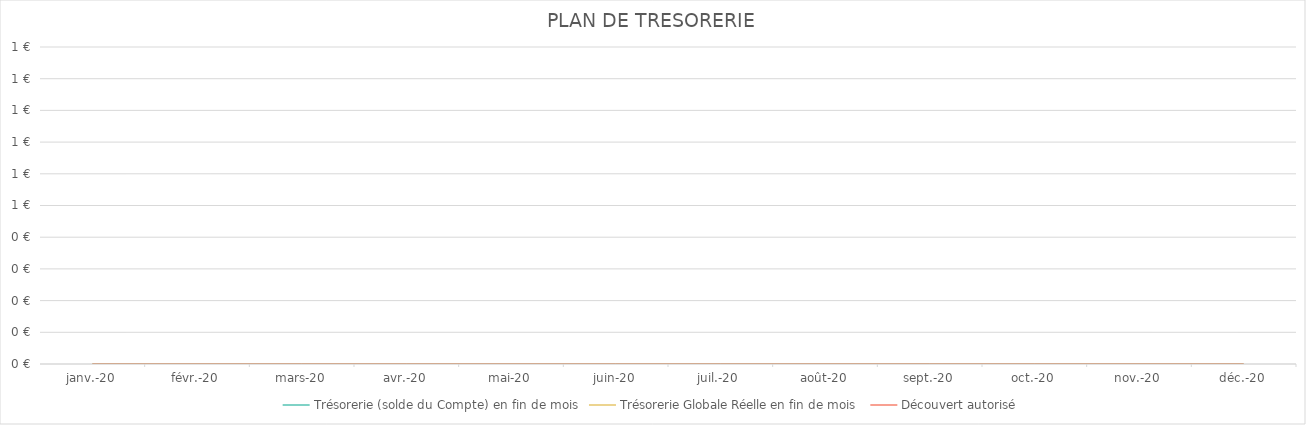
| Category | Trésorerie (solde du Compte) en fin de mois | Trésorerie Globale Réelle en fin de mois | Découvert autorisé |
|---|---|---|---|
| 2020-01-01 | 0 | 0 | 0 |
| 2020-02-29 | 0 | 0 | 0 |
| 2020-03-31 | 0 | 0 | 0 |
| 2020-04-30 | 0 | 0 | 0 |
| 2020-05-31 | 0 | 0 | 0 |
| 2020-06-30 | 0 | 0 | 0 |
| 2020-07-31 | 0 | 0 | 0 |
| 2020-08-31 | 0 | 0 | 0 |
| 2020-09-30 | 0 | 0 | 0 |
| 2020-10-31 | 0 | 0 | 0 |
| 2020-11-30 | 0 | 0 | 0 |
| 2020-12-31 | 0 | 0 | 0 |